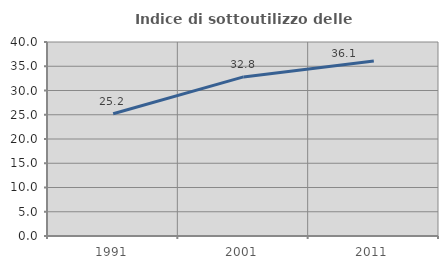
| Category | Indice di sottoutilizzo delle abitazioni  |
|---|---|
| 1991.0 | 25.216 |
| 2001.0 | 32.8 |
| 2011.0 | 36.102 |